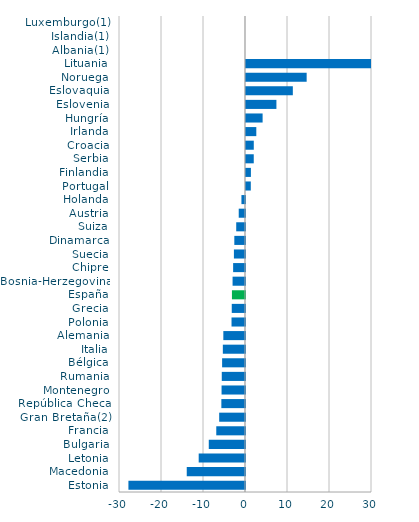
| Category | Series 0 |
|---|---|
| Estonia | -27.757 |
| Macedonia | -13.869 |
| Letonia | -11.024 |
| Bulgaria | -8.624 |
| Francia | -6.84 |
| Gran Bretaña(2) | -6.146 |
| República Checa | -5.63 |
| Montenegro | -5.581 |
| Rumania | -5.532 |
| Bélgica | -5.449 |
| Italia | -5.278 |
| Alemania | -5.16 |
| Polonia | -3.208 |
| Grecia | -3.154 |
| España | -3.11 |
| Bosnia-Herzegovina | -2.957 |
| Chipre | -2.827 |
| Suecia | -2.641 |
| Dinamarca | -2.544 |
| Suiza | -2.091 |
| Austria | -1.493 |
| Holanda | -0.847 |
| Portugal | 1.144 |
| Finlandia | 1.168 |
| Serbia | 1.845 |
| Croacia | 1.853 |
| Irlanda | 2.453 |
| Hungría | 3.954 |
| Eslovenia | 7.242 |
| Eslovaquia | 11.151 |
| Noruega | 14.442 |
| Lituania | 36.024 |
| Albania(1) | 0 |
| Islandia(1) | 0 |
| Luxemburgo(1) | 0 |